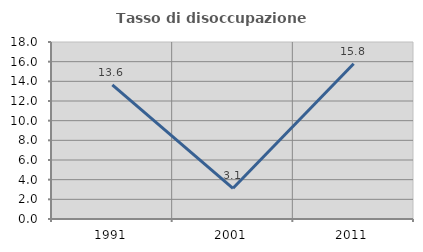
| Category | Tasso di disoccupazione giovanile  |
|---|---|
| 1991.0 | 13.636 |
| 2001.0 | 3.125 |
| 2011.0 | 15.789 |